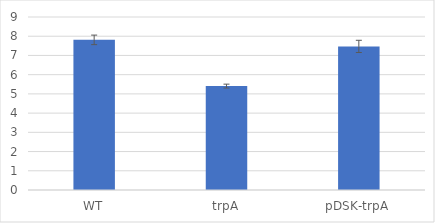
| Category | Series 0 |
|---|---|
| WT | 7.81 |
| trpA | 5.406 |
| pDSK-trpA | 7.471 |